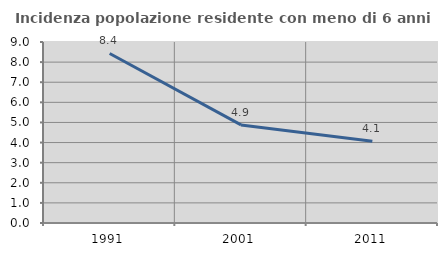
| Category | Incidenza popolazione residente con meno di 6 anni |
|---|---|
| 1991.0 | 8.43 |
| 2001.0 | 4.878 |
| 2011.0 | 4.059 |